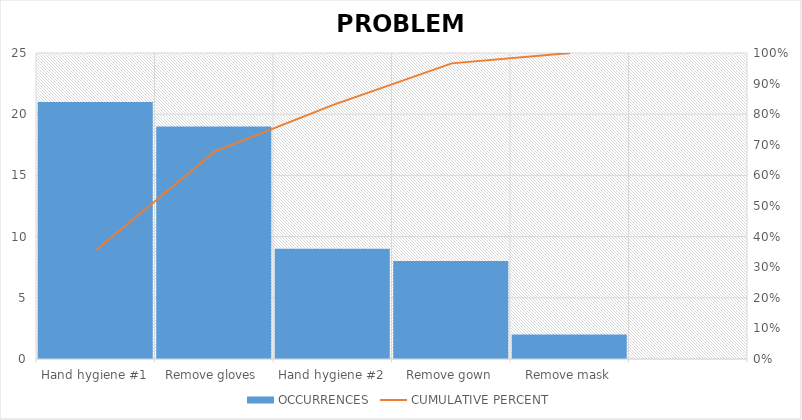
| Category | OCCURRENCES |
|---|---|
| Hand hygiene #1 | 21 |
| Remove gloves | 19 |
| Hand hygiene #2 | 9 |
| Remove gown | 8 |
| Remove mask | 2 |